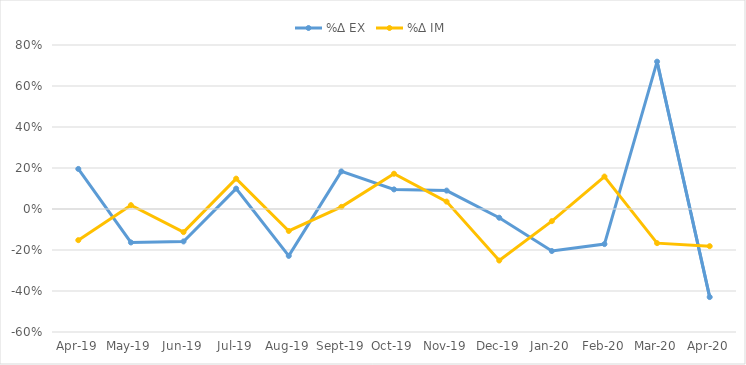
| Category | %∆ EX | %∆ IM |
|---|---|---|
| 2019-04-19 | 0.195 | -0.152 |
| 2019-05-19 | -0.163 | 0.019 |
| 2019-06-19 | -0.158 | -0.113 |
| 2019-07-19 | 0.099 | 0.148 |
| 2019-08-19 | -0.229 | -0.107 |
| 2019-09-19 | 0.183 | 0.01 |
| 2019-10-19 | 0.096 | 0.172 |
| 2019-11-19 | 0.09 | 0.036 |
| 2019-12-19 | -0.043 | -0.251 |
| 2020-01-19 | -0.205 | -0.059 |
| 2020-02-19 | -0.171 | 0.158 |
| 2020-03-19 | 0.719 | -0.167 |
| 2020-04-19 | -0.43 | -0.181 |